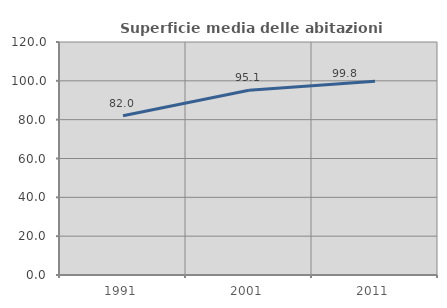
| Category | Superficie media delle abitazioni occupate |
|---|---|
| 1991.0 | 81.992 |
| 2001.0 | 95.132 |
| 2011.0 | 99.78 |